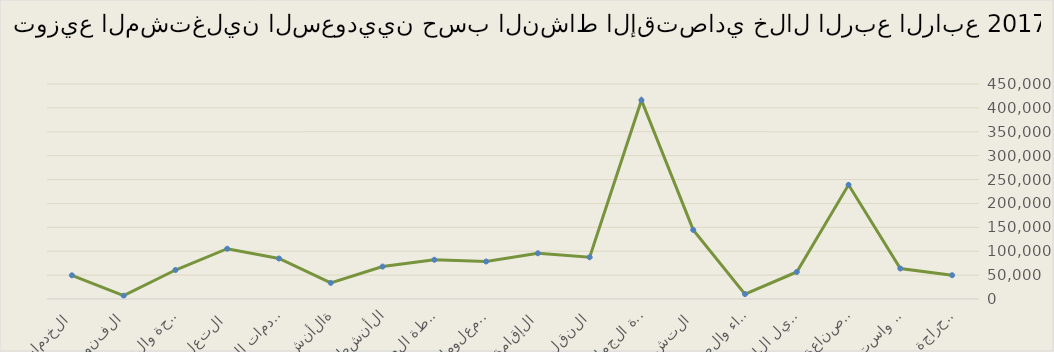
| Category | Series 0 |
|---|---|
| الزراعة والحراجة وصيد الأسماك | 49781 |
| التعدين واستغلال المحاجر | 63792 |
| الصناعة التحويلية | 238952 |
| توصيل الكهرباء والغاز  | 56521 |
| امدادات الماء والصرف الصحي | 10296 |
| التشييد | 144569 |
| تجارة الجملة والتجزئة | 416117 |
| النقل والتخزين | 87402 |
| الإقامة والطعام | 95765 |
| المعلومات والاتصالات | 78491 |
| أنشطة المال والتأمين | 82121 |
| الأنشطة العقارية | 67887 |
| الأنشطة المهنية  | 33696 |
| الخدمات الإدارية والدعم | 84742 |
| التعليم | 105209 |
| الصحة والعمل الاجتماعي | 60700 |
| الفنون والترفية | 6899 |
| الخدمات الأخرى | 49618 |